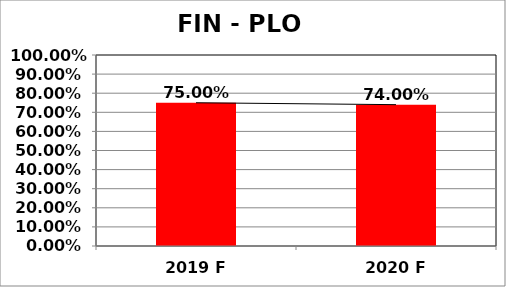
| Category | Series 0 |
|---|---|
| 2019 F | 0.75 |
| 2020 F | 0.74 |